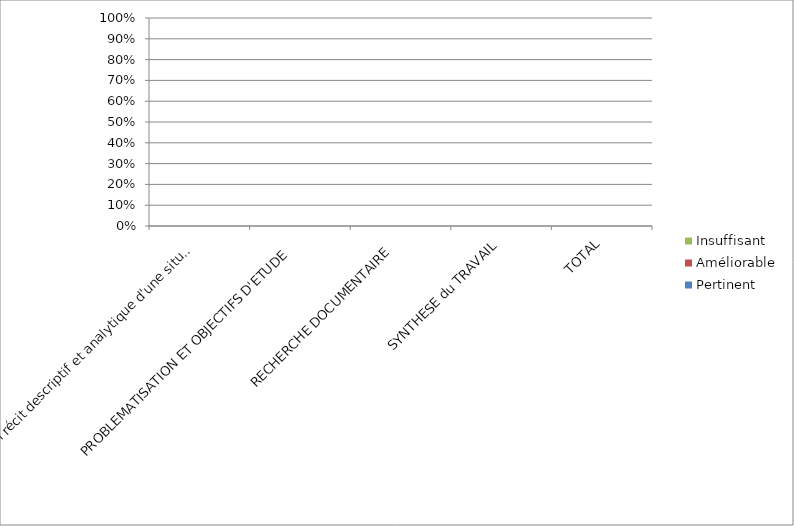
| Category | Pertinent | Améliorable | Insuffisant |
|---|---|---|---|
| Le RSCA est un récit descriptif et analytique d'une situation professionnelle complexe vécue par l'interne | 0 | 0 | 0 |
| PROBLEMATISATION ET OBJECTIFS D'ETUDE   | 0 | 0 | 0 |
| RECHERCHE DOCUMENTAIRE   | 0 | 0 | 0 |
| SYNTHESE du TRAVAIL | 0 | 0 | 0 |
| TOTAL | 0 | 0 | 0 |